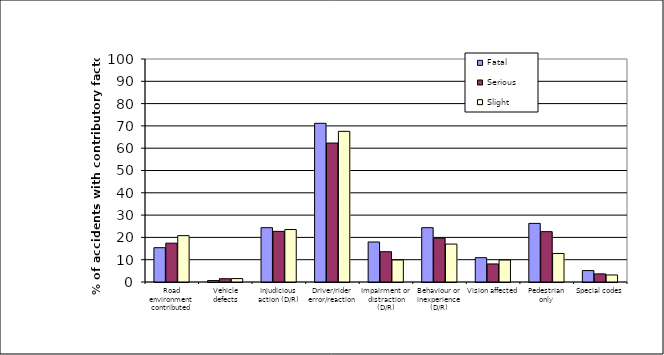
| Category | Fatal | Serious | Slight |
|---|---|---|---|
| Road environment contributed | 15.385 | 17.411 | 20.787 |
| Vehicle defects | 0.641 | 1.467 | 1.529 |
| Injudicious action (D/R) | 24.359 | 22.704 | 23.533 |
| Driver/rider error/reaction | 71.154 | 62.309 | 67.556 |
| Impairment or distraction (D/R) | 17.949 | 13.584 | 9.863 |
| Behaviour or inexperience (D/R) | 24.359 | 19.643 | 17.01 |
| Vision affected | 10.897 | 8.099 | 9.847 |
| Pedestrian only | 26.282 | 22.577 | 12.781 |
| Special codes | 5.128 | 3.635 | 3.152 |